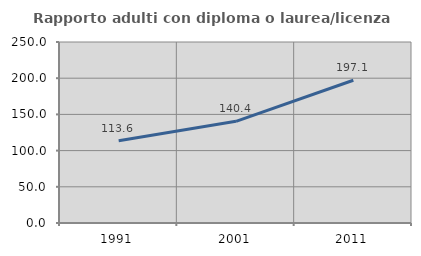
| Category | Rapporto adulti con diploma o laurea/licenza media  |
|---|---|
| 1991.0 | 113.559 |
| 2001.0 | 140.403 |
| 2011.0 | 197.136 |